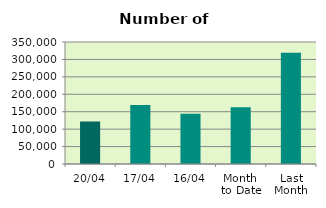
| Category | Series 0 |
|---|---|
| 20/04 | 121950 |
| 17/04 | 169448 |
| 16/04 | 143948 |
| Month 
to Date | 163069.667 |
| Last
Month | 318803.545 |